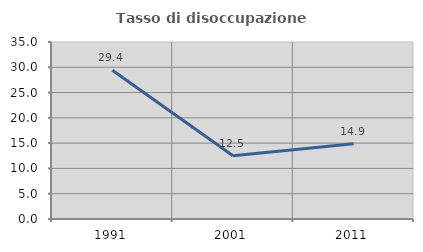
| Category | Tasso di disoccupazione giovanile  |
|---|---|
| 1991.0 | 29.412 |
| 2001.0 | 12.5 |
| 2011.0 | 14.894 |